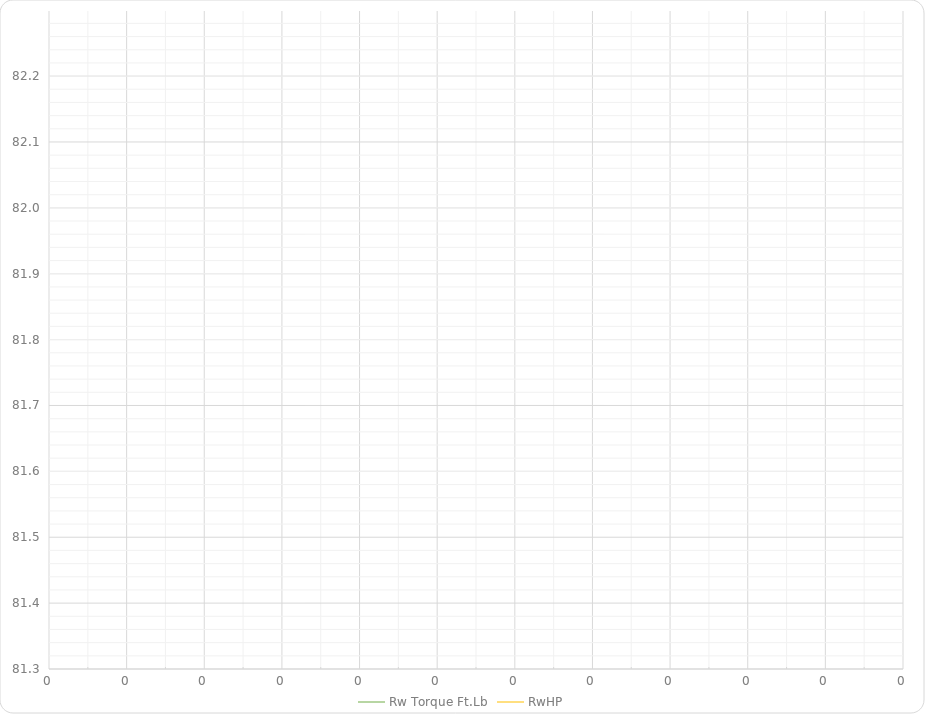
| Category | Rw Torque Ft.Lb | RwHP |
|---|---|---|
| 0.0 | 0 | 0 |
| 0.0 | 0 | 0 |
| 0.0 | 0 | 0 |
| 0.0 | 0 | 0 |
| 0.0 | 0 | 0 |
| 0.0 | 0 | 0 |
| 0.0 | 0 | 0 |
| 0.0 | 0 | 0 |
| 0.0 | 0 | 0 |
| 0.0 | 0 | 0 |
| 0.0 | 0 | 0 |
| 0.0 | 0 | 0 |